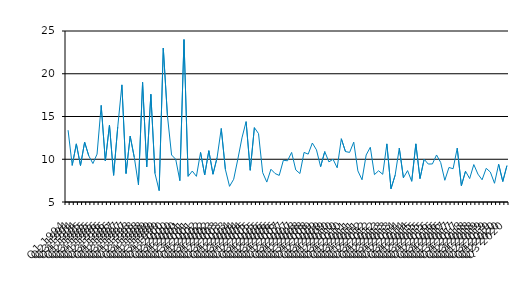
| Category | Series 0 |
|---|---|
| Q1 1994 | 13.4 |
| Q2 1994 | 9.28 |
| Q3 1994 | 11.8 |
| Q4 1994 | 9.26 |
| Q1 1995 | 12 |
| Q2 1995 | 10.4 |
| Q3 1995 | 9.5 |
| Q4 1995 | 10.6 |
| Q1 1996 | 16.3 |
| Q2 1996 | 9.8 |
| Q3 1996 | 14 |
| Q4 1996 | 8.12 |
| Q1 1997 | 13.8 |
| Q2 1997 | 18.7 |
| Q3 1997 | 8.33 |
| Q4 1997 | 12.7 |
| Q1 1998 | 10.2 |
| Q2 1998 | 7 |
| Q3 1998 | 19 |
| Q4 1998 | 9.11 |
| Q1 1999 | 17.6 |
| Q2 1999 | 8.33 |
| Q3 1999 | 6.33 |
| Q4 1999 | 23 |
| Q1 2000 | 15.1 |
| Q2 2000 | 10.5 |
| Q3 2000 | 10 |
| Q4 2000 | 7.5 |
| Q1 2001 | 24 |
| Q2 2001 | 8 |
| Q3 2001 | 8.62 |
| Q4 2001 | 8 |
| Q1 2002 | 10.8 |
| Q2 2002 | 8.16 |
| Q3 2002 | 11 |
| Q4 2002 | 8.25 |
| Q1 2003 | 10.2 |
| Q2 2003 | 13.6 |
| Q3 2003 | 8.8 |
| Q4 2003 | 6.83 |
| Q1 2004 | 7.66 |
| Q2 2004 | 10 |
| Q3 2004 | 12.5 |
| Q4 2004 | 14.4 |
| Q1 2005 | 8.71 |
| Q2 2005 | 13.7 |
| Q3 2005 | 13 |
| Q4 2005 | 8.44 |
| Q1 2006 | 7.33 |
| Q2 2006 | 8.83 |
| Q3 2006 | 8.33 |
| Q4 2006 | 8.11 |
| Q1 2007 | 9.88 |
| Q2 2007 | 9.82 |
| Q3 2007 | 10.8 |
| Q4 2007 | 8.75 |
| Q1 2008 | 8.33 |
| Q2 2008 | 10.8 |
| Q3 2008 | 10.6 |
| Q4 2008 | 11.9 |
| Q1 2009 | 11.1 |
| Q2 2009 | 9.13 |
| Q3 2009 | 10.9 |
| Q4 2009 | 9.69 |
| Q1 2010 | 10 |
| Q2 2010 | 9 |
| Q3 2010 | 12.4 |
| Q4 2010 | 10.9 |
| Q1 2011 | 10.8 |
| Q2 2011 | 12 |
| Q3 2011 | 8.64 |
| Q4 2011 | 7.6 |
| Q1 2012 | 10.5 |
| Q2 2012 | 11.4 |
| Q3 2012 | 8.2 |
| Q4 2012 | 8.65 |
| Q1 2013 | 8.24 |
| Q2 2013 | 11.8 |
| Q3 2013 | 6.55 |
| Q4 2013 | 8.14 |
| Q1 2014 | 11.3 |
| Q2 2014 | 7.83 |
| Q3 2014 | 8.67 |
| Q4 2014 | 7.42 |
| Q1 2015 | 11.8 |
| Q2 2015 | 7.74 |
| Q3 2015 | 10 |
| Q4 2015 | 9.44 |
| Q1 2016 | 9.45 |
| Q2 2016 | 10.5 |
| Q3 2016 | 9.62 |
| Q4 2016 | 7.54 |
| Q1 2017 | 9.04 |
| Q2 2017 | 8.89 |
| Q3 2017 | 11.3 |
| Q4 2017 | 6.91 |
| Q1 2018 | 8.6 |
| Q2 2018 | 7.74 |
| Q3 2018 | 9.38 |
| Q4 2018 | 8.26 |
| Q1 2019 | 7.6 |
| Q2 2019 | 8.941 |
| Q3 2019 | 8.5 |
| Q4 2019 | 7.19 |
| Q1 2020 | 9.41 |
| Q2 2020 | 7.4 |
| Q3 2020 | 9.25 |